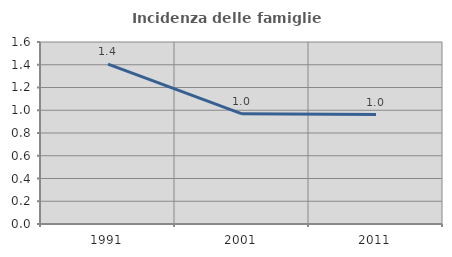
| Category | Incidenza delle famiglie numerose |
|---|---|
| 1991.0 | 1.406 |
| 2001.0 | 0.969 |
| 2011.0 | 0.962 |